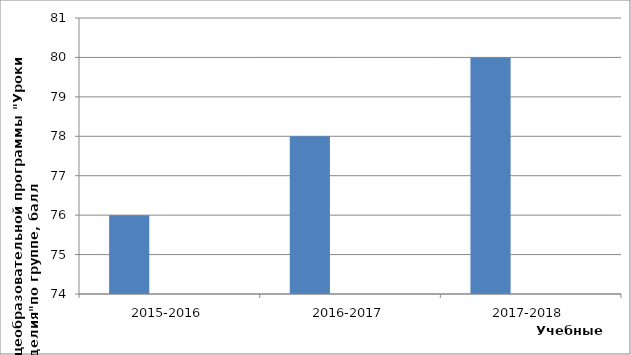
| Category | Series 0 | Series 1 | Series 2 |
|---|---|---|---|
| 2015-2016 | 76 |  |  |
| 2016-2017 | 78 |  |  |
| 2017-2018 | 80 |  |  |